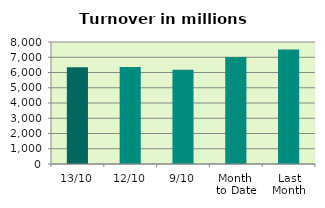
| Category | Series 0 |
|---|---|
| 13/10 | 6349.311 |
| 12/10 | 6358.872 |
| 9/10 | 6177.662 |
| Month 
to Date | 7014.128 |
| Last
Month | 7507.246 |